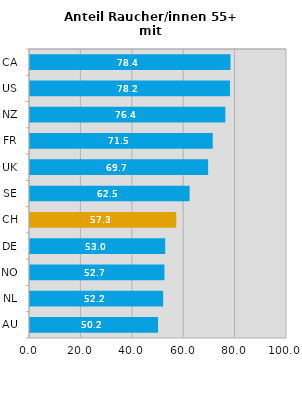
| Category | Anteil Raucher/innen 55+ mit Rauchstopp-Gesprächen |
|---|---|
| CA | 78.4 |
| US | 78.2 |
| NZ | 76.4 |
| FR | 71.5 |
| UK | 69.7 |
| SE | 62.5 |
| CH | 57.3 |
| DE | 53 |
| NO | 52.7 |
| NL | 52.2 |
| AU | 50.2 |